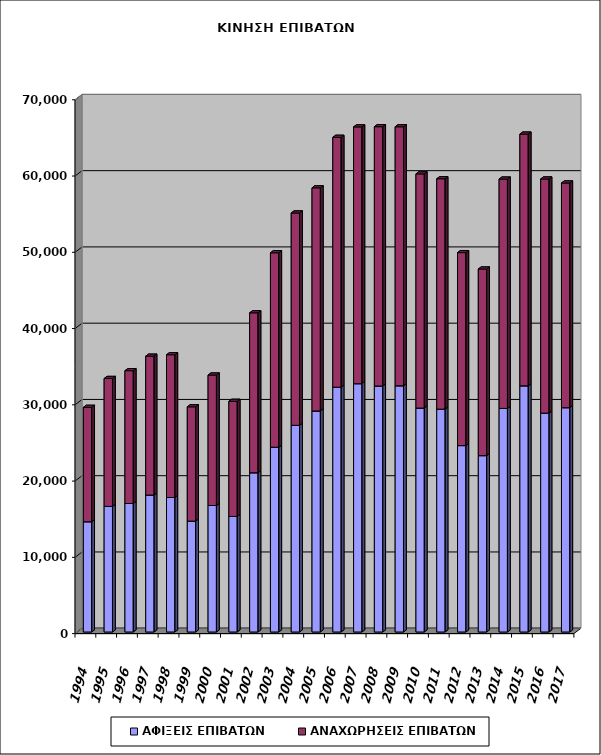
| Category | ΑΦΙΞΕΙΣ ΕΠΙΒΑΤΩΝ | ΑΝΑΧΩΡΗΣΕΙΣ ΕΠΙΒΑΤΩΝ |
|---|---|---|
| 1994.0 | 14456 | 14998 |
| 1995.0 | 16466 | 16777 |
| 1996.0 | 16848 | 17417 |
| 1997.0 | 17959 | 18207 |
| 1998.0 | 17637 | 18716 |
| 1999.0 | 14541 | 14986 |
| 2000.0 | 16585 | 17107 |
| 2001.0 | 15151 | 15095 |
| 2002.0 | 20881 | 20971 |
| 2003.0 | 24229 | 25498 |
| 2004.0 | 27102 | 27844 |
| 2005.0 | 28983 | 29258 |
| 2006.0 | 32099 | 32767 |
| 2007.0 | 32560 | 33673 |
| 2008.0 | 32257 | 34003 |
| 2009.0 | 32285 | 33964 |
| 2010.0 | 29363 | 30709 |
| 2011.0 | 29222 | 30210 |
| 2012.0 | 24442 | 25304 |
| 2013.0 | 23126 | 24469 |
| 2014.0 | 29318 | 30072 |
| 2015.0 | 32281 | 33007 |
| 2016.0 | 28699 | 30703 |
| 2017.0 | 29414 | 29461 |